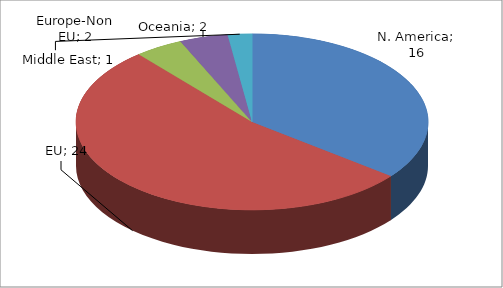
| Category | Series 0 |
|---|---|
| N. America | 16 |
| EU | 24 |
| Europe-Non EU | 2 |
| Oceania | 2 |
| Middle East | 1 |